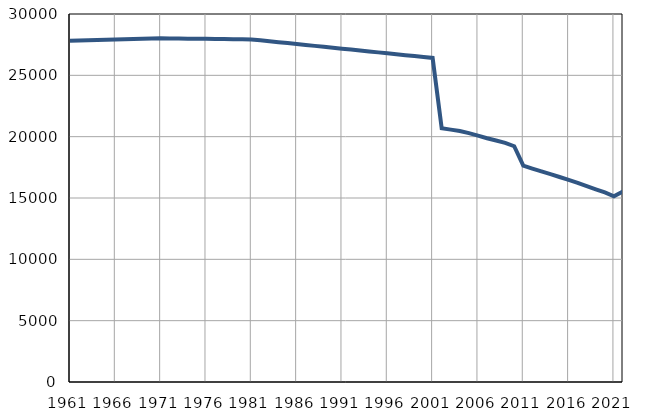
| Category | Број
становника |
|---|---|
| 1961.0 | 27819 |
| 1962.0 | 27839 |
| 1963.0 | 27859 |
| 1964.0 | 27879 |
| 1965.0 | 27899 |
| 1966.0 | 27919 |
| 1967.0 | 27939 |
| 1968.0 | 27959 |
| 1969.0 | 27979 |
| 1970.0 | 27999 |
| 1971.0 | 28019 |
| 1972.0 | 28010 |
| 1973.0 | 28001 |
| 1974.0 | 27992 |
| 1975.0 | 27983 |
| 1976.0 | 27973 |
| 1977.0 | 27965 |
| 1978.0 | 27956 |
| 1979.0 | 27947 |
| 1980.0 | 27937 |
| 1981.0 | 27929 |
| 1982.0 | 27853 |
| 1983.0 | 27778 |
| 1984.0 | 27703 |
| 1985.0 | 27627 |
| 1986.0 | 27552 |
| 1987.0 | 27476 |
| 1988.0 | 27401 |
| 1989.0 | 27325 |
| 1990.0 | 27250 |
| 1991.0 | 27174 |
| 1992.0 | 27098 |
| 1993.0 | 27023 |
| 1994.0 | 26947 |
| 1995.0 | 26872 |
| 1996.0 | 26796 |
| 1997.0 | 26721 |
| 1998.0 | 26645 |
| 1999.0 | 26570 |
| 2000.0 | 26494 |
| 2001.0 | 26419 |
| 2002.0 | 20680 |
| 2003.0 | 20575 |
| 2004.0 | 20458 |
| 2005.0 | 20288 |
| 2006.0 | 20081 |
| 2007.0 | 19868 |
| 2008.0 | 19689 |
| 2009.0 | 19495 |
| 2010.0 | 19219 |
| 2011.0 | 17637 |
| 2012.0 | 17395 |
| 2013.0 | 17165 |
| 2014.0 | 16948 |
| 2015.0 | 16714 |
| 2016.0 | 16478 |
| 2017.0 | 16235 |
| 2018.0 | 15966 |
| 2019.0 | 15707 |
| 2020.0 | 15451 |
| 2021.0 | 15144 |
| 2022.0 | 15521 |